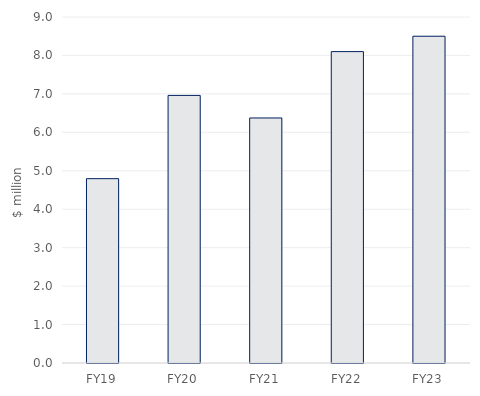
| Category | Net sales |
|---|---|
| FY19 | 4.795 |
| FY20 | 6.96 |
| FY21 | 6.374 |
| FY22 | 8.1 |
| FY23 | 8.5 |